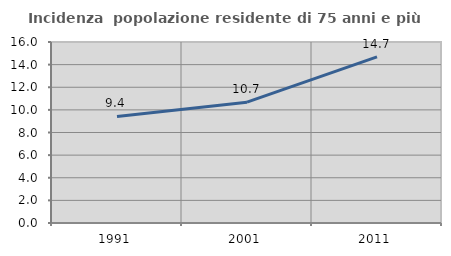
| Category | Incidenza  popolazione residente di 75 anni e più |
|---|---|
| 1991.0 | 9.415 |
| 2001.0 | 10.679 |
| 2011.0 | 14.692 |